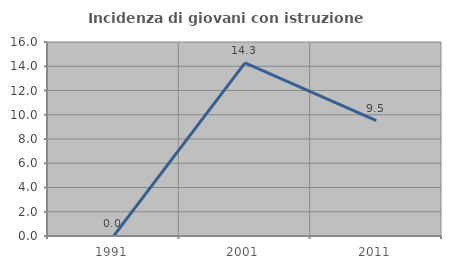
| Category | Incidenza di giovani con istruzione universitaria |
|---|---|
| 1991.0 | 0 |
| 2001.0 | 14.286 |
| 2011.0 | 9.524 |